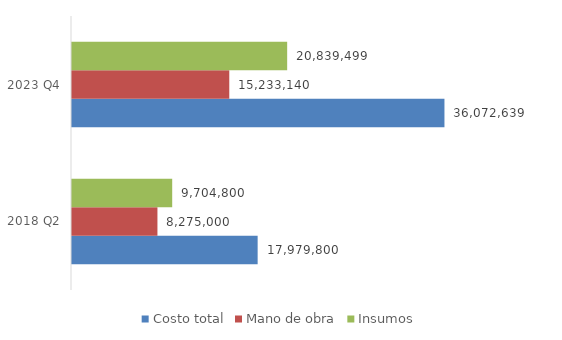
| Category | Costo total | Mano de obra | Insumos |
|---|---|---|---|
| 2018 Q2 | 17979800 | 8275000 | 9704800 |
| 2023 Q4 | 36072638.991 | 15233140 | 20839498.991 |